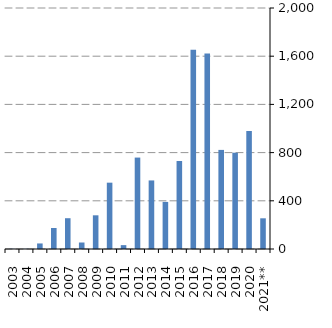
| Category | Series 0 |
|---|---|
| 2003 | 1767.354 |
| 2004 | 1678.134 |
| 2005 | 46046.057 |
| 2006 | 174413.893 |
| 2007 | 255500.456 |
| 2008 | 53922.246 |
| 2009 | 279592.991 |
| 2010 | 550429.259 |
| 2011 | 32072.069 |
| 2012 | 758704.971 |
| 2013 | 568995.727 |
| 2014 | 390724.913 |
| 2015 | 730079.341 |
| 2016 | 1654338.976 |
| 2017 | 1623164.921 |
| 2018 | 822387.086 |
| 2019 | 799060.732 |
| 2020 | 979325.301 |
| 2021** | 254780.259 |